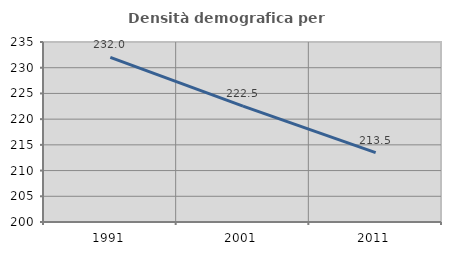
| Category | Densità demografica |
|---|---|
| 1991.0 | 232.021 |
| 2001.0 | 222.544 |
| 2011.0 | 213.5 |